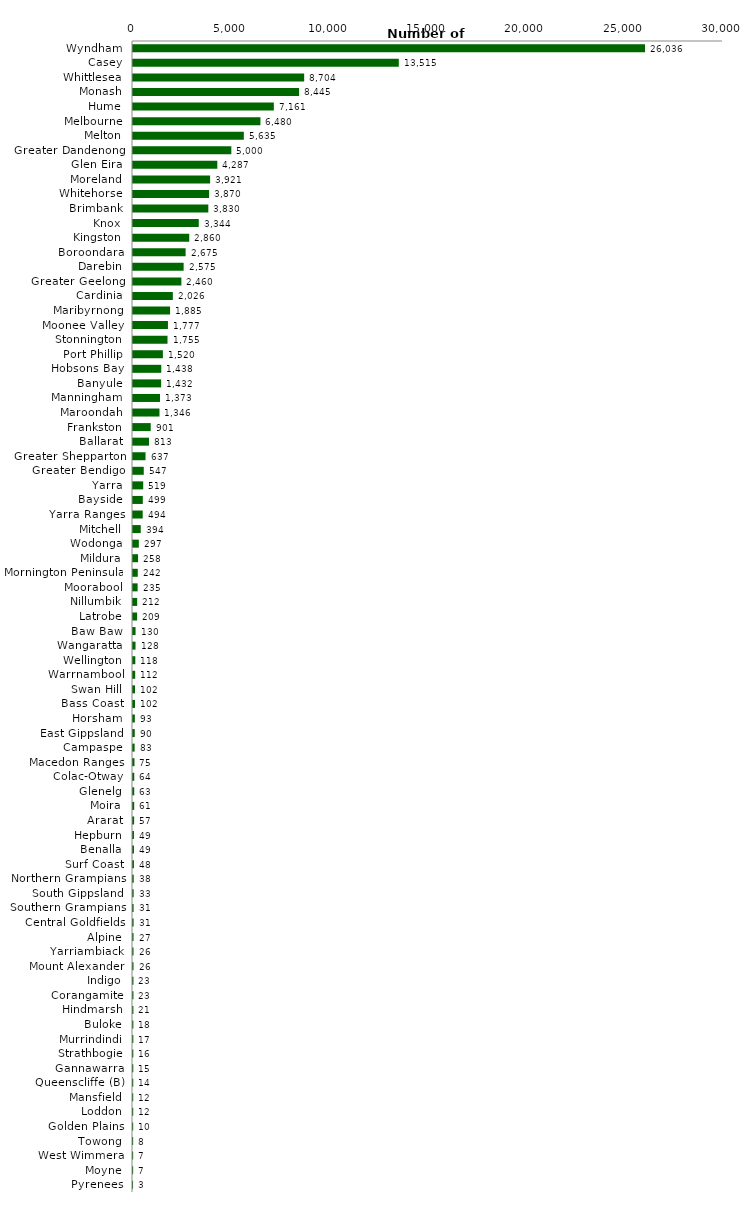
| Category | Series 0 |
|---|---|
| Wyndham | 26036 |
| Casey | 13515 |
| Whittlesea | 8704 |
| Monash | 8445 |
| Hume | 7161 |
| Melbourne | 6480 |
| Melton | 5635 |
| Greater Dandenong | 5000 |
| Glen Eira | 4287 |
| Moreland | 3921 |
| Whitehorse | 3870 |
| Brimbank | 3830 |
| Knox | 3344 |
| Kingston | 2860 |
| Boroondara | 2675 |
| Darebin | 2575 |
| Greater Geelong | 2460 |
| Cardinia | 2026 |
| Maribyrnong | 1885 |
| Moonee Valley | 1777 |
| Stonnington | 1755 |
| Port Phillip | 1520 |
| Hobsons Bay | 1438 |
| Banyule | 1432 |
| Manningham | 1373 |
| Maroondah | 1346 |
| Frankston | 901 |
| Ballarat | 813 |
| Greater Shepparton | 637 |
| Greater Bendigo | 547 |
| Yarra | 519 |
| Bayside | 499 |
| Yarra Ranges | 494 |
| Mitchell | 394 |
| Wodonga | 297 |
| Mildura | 258 |
| Mornington Peninsula | 242 |
| Moorabool | 235 |
| Nillumbik | 212 |
| Latrobe | 209 |
| Baw Baw | 130 |
| Wangaratta | 128 |
| Wellington | 118 |
| Warrnambool | 112 |
| Swan Hill | 102 |
| Bass Coast | 102 |
| Horsham | 93 |
| East Gippsland | 90 |
| Campaspe | 83 |
| Macedon Ranges | 75 |
| Colac-Otway | 64 |
| Glenelg | 63 |
| Moira | 61 |
| Ararat | 57 |
| Hepburn | 49 |
| Benalla | 49 |
| Surf Coast | 48 |
| Northern Grampians | 38 |
| South Gippsland | 33 |
| Southern Grampians | 31 |
| Central Goldfields | 31 |
| Alpine | 27 |
| Yarriambiack | 26 |
| Mount Alexander | 26 |
| Indigo | 23 |
| Corangamite | 23 |
| Hindmarsh | 21 |
| Buloke | 18 |
| Murrindindi | 17 |
| Strathbogie | 16 |
| Gannawarra | 15 |
| Queenscliffe (B) | 14 |
| Mansfield | 12 |
| Loddon | 12 |
| Golden Plains | 10 |
| Towong | 8 |
| West Wimmera | 7 |
| Moyne | 7 |
| Pyrenees | 3 |